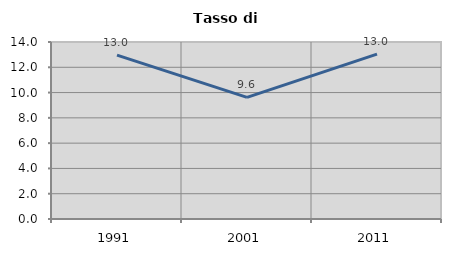
| Category | Tasso di disoccupazione   |
|---|---|
| 1991.0 | 12.965 |
| 2001.0 | 9.618 |
| 2011.0 | 13.043 |